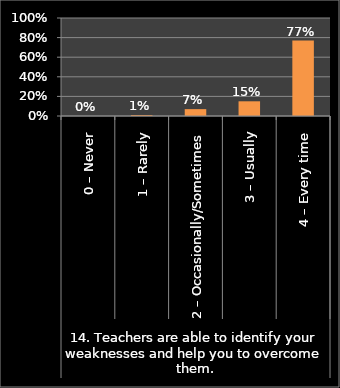
| Category | Series 0 |
|---|---|
| 0 | 0 |
| 1 | 0.01 |
| 2 | 0.07 |
| 3 | 0.15 |
| 4 | 0.77 |